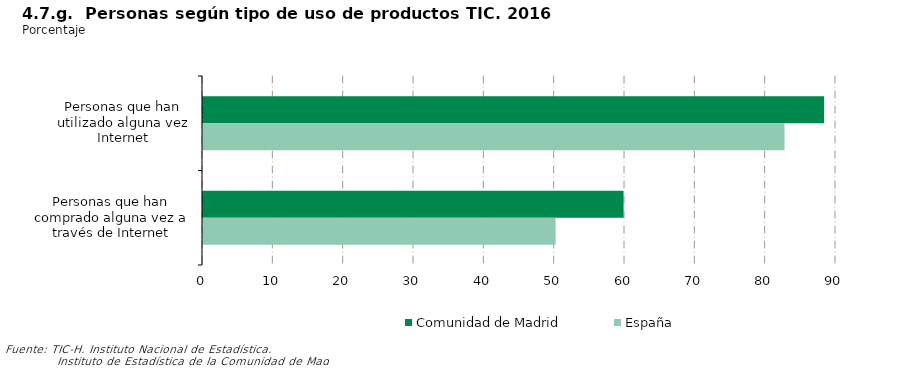
| Category | Comunidad de Madrid | España |
|---|---|---|
| Personas que han utilizado alguna vez Internet | 88.312 | 82.682 |
| Personas que han comprado alguna vez a través de Internet | 59.794 | 50.133 |